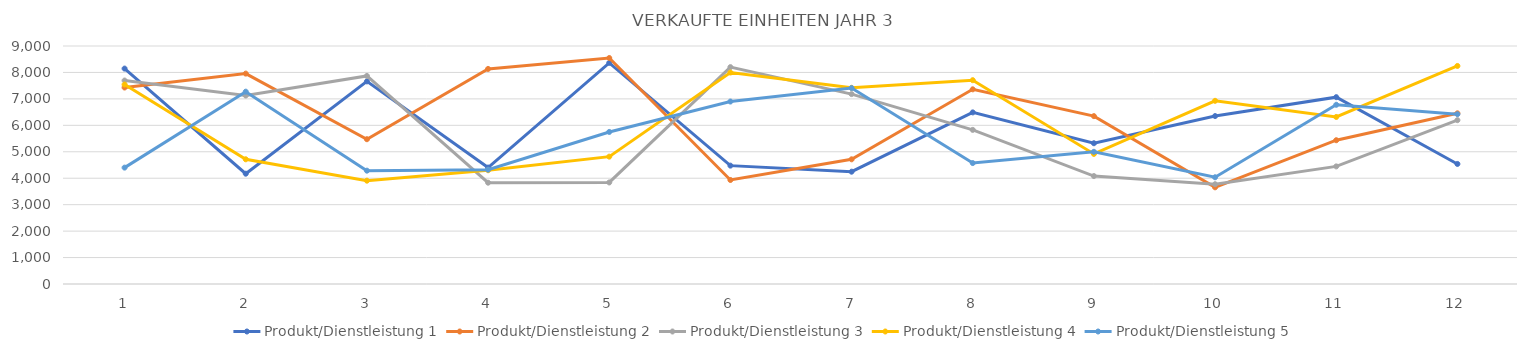
| Category | Produkt/Dienstleistung 1 | Produkt/Dienstleistung 2 | Produkt/Dienstleistung 3 | Produkt/Dienstleistung 4 | Produkt/Dienstleistung 5 |
|---|---|---|---|---|---|
| 0 | 8146 | 7430 | 7694 | 7544 | 4401 |
| 1 | 4171 | 7956 | 7127 | 4716 | 7273 |
| 2 | 7662 | 5475 | 7868 | 3907 | 4286 |
| 3 | 4404 | 8133 | 3831 | 4302 | 4322 |
| 4 | 8362 | 8546 | 3840 | 4816 | 5750 |
| 5 | 4476 | 3933 | 8201 | 7998 | 6900 |
| 6 | 4247 | 4715 | 7181 | 7419 | 7411 |
| 7 | 6489 | 7362 | 5828 | 7707 | 4573 |
| 8 | 5323 | 6348 | 4082 | 4919 | 4999 |
| 9 | 6351 | 3656 | 3773 | 6927 | 4036 |
| 10 | 7065 | 5437 | 4447 | 6317 | 6777 |
| 11 | 4540 | 6454 | 6195 | 8245 | 6421 |